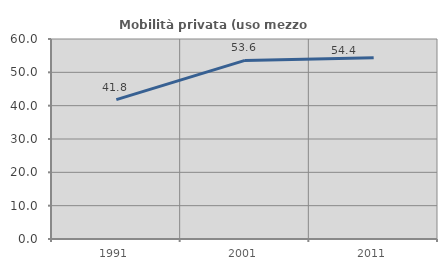
| Category | Mobilità privata (uso mezzo privato) |
|---|---|
| 1991.0 | 41.803 |
| 2001.0 | 53.573 |
| 2011.0 | 54.373 |